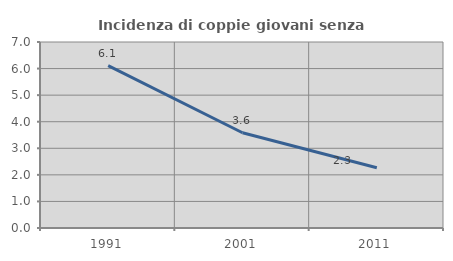
| Category | Incidenza di coppie giovani senza figli |
|---|---|
| 1991.0 | 6.114 |
| 2001.0 | 3.584 |
| 2011.0 | 2.269 |